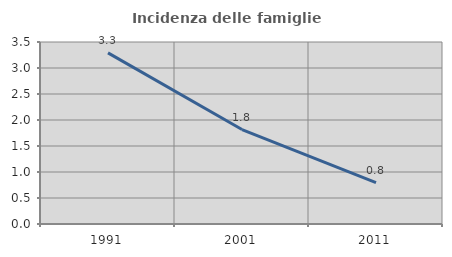
| Category | Incidenza delle famiglie numerose |
|---|---|
| 1991.0 | 3.29 |
| 2001.0 | 1.816 |
| 2011.0 | 0.796 |